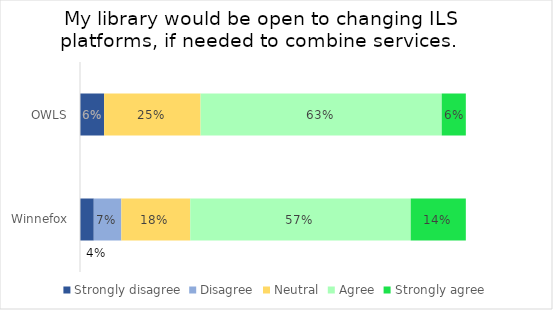
| Category | Strongly disagree | Disagree | Neutral | Agree | Strongly agree |
|---|---|---|---|---|---|
| OWLS | 0.062 | 0 | 0.25 | 0.625 | 0.062 |
| Winnefox | 0.036 | 0.071 | 0.179 | 0.571 | 0.143 |